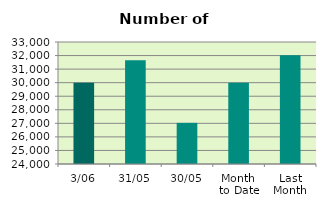
| Category | Series 0 |
|---|---|
| 3/06 | 29996 |
| 31/05 | 31660 |
| 30/05 | 27034 |
| Month 
to Date | 29996 |
| Last
Month | 32020.364 |